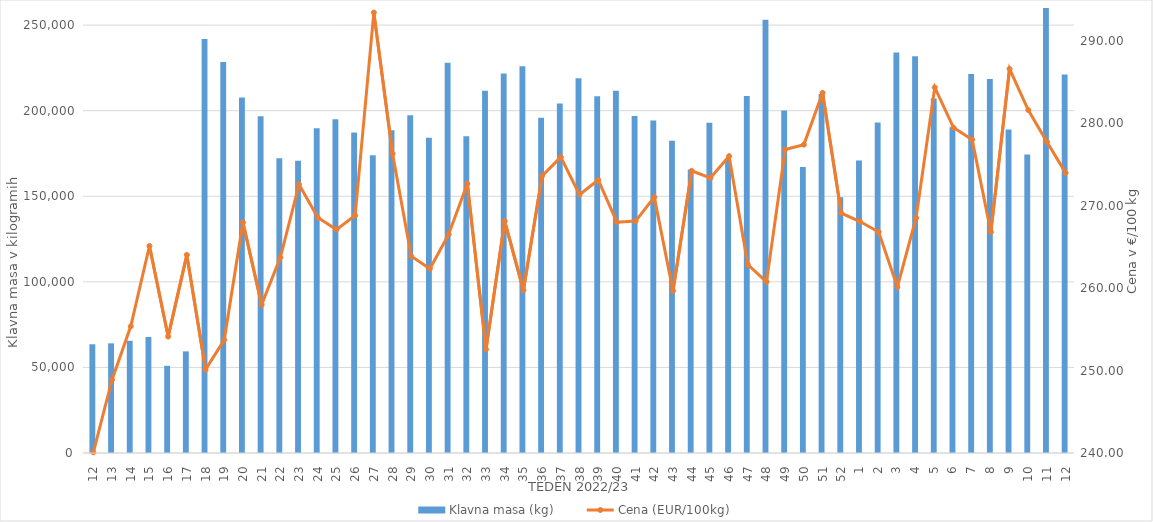
| Category | Klavna masa (kg) |
|---|---|
| 12.0 | 63530 |
| 13.0 | 64069 |
| 14.0 | 65564 |
| 15.0 | 67787 |
| 16.0 | 50958 |
| 17.0 | 59387 |
| 18.0 | 241833 |
| 19.0 | 228389 |
| 20.0 | 207661 |
| 21.0 | 196732 |
| 22.0 | 172190 |
| 23.0 | 170751 |
| 24.0 | 189775 |
| 25.0 | 195029 |
| 26.0 | 187239 |
| 27.0 | 173967 |
| 28.0 | 188601 |
| 29.0 | 197293 |
| 30.0 | 184259 |
| 31.0 | 228023 |
| 32.0 | 185079 |
| 33.0 | 211612 |
| 34.0 | 221748 |
| 35.0 | 225927 |
| 36.0 | 195924 |
| 37.0 | 204224 |
| 38.0 | 218966 |
| 39.0 | 208403 |
| 40.0 | 211635 |
| 41.0 | 196841 |
| 42.0 | 194271 |
| 43.0 | 182399 |
| 44.0 | 165696 |
| 45.0 | 193022 |
| 46.0 | 171172 |
| 47.0 | 208597 |
| 48.0 | 253151 |
| 49.0 | 200117 |
| 50.0 | 167119 |
| 51.0 | 209797 |
| 52.0 | 149439 |
| 1.0 | 170843 |
| 2.0 | 193093 |
| 3.0 | 234042 |
| 4.0 | 231737 |
| 5.0 | 207136 |
| 6.0 | 190311 |
| 7.0 | 221366 |
| 8.0 | 218470 |
| 9.0 | 189006 |
| 10.0 | 174425 |
| 11.0 | 265476 |
| 12.0 | 221171 |